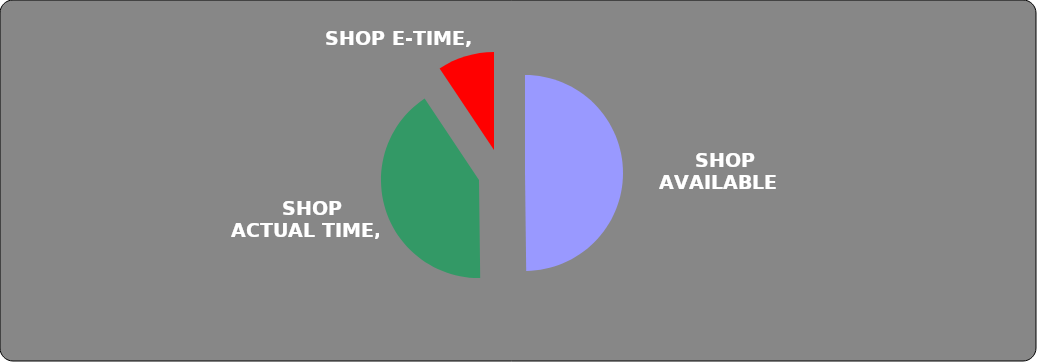
| Category | Series 0 | Series 1 |
|---|---|---|
|   SHOP AVAILABLE TIME | 5377.36 |  |
|   SHOP ACTUAL TIME | 4409.31 |  |
|   SHOP E-TIME | 1010.61 |  |